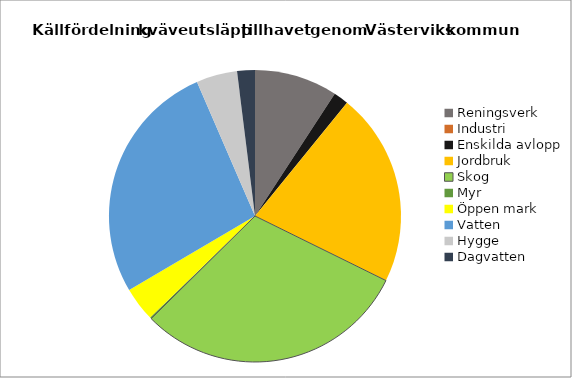
| Category | Series 0 | Series 1 |
|---|---|---|
| Reningsverk | 33744.052 | 0.092 |
| Industri | 0 | 0 |
| Enskilda avlopp | 6055.25 | 0.017 |
| Jordbruk | 78632.75 | 0.214 |
| Skog | 111146.75 | 0.303 |
| Myr | 630.75 | 0.002 |
| Öppen mark | 13867 | 0.038 |
| Vatten | 98881 | 0.27 |
| Hygge | 16632.75 | 0.045 |
| Dagvatten | 7222 | 0.02 |